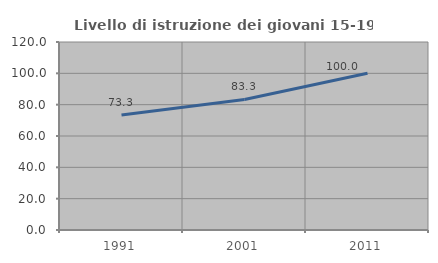
| Category | Livello di istruzione dei giovani 15-19 anni |
|---|---|
| 1991.0 | 73.333 |
| 2001.0 | 83.333 |
| 2011.0 | 100 |